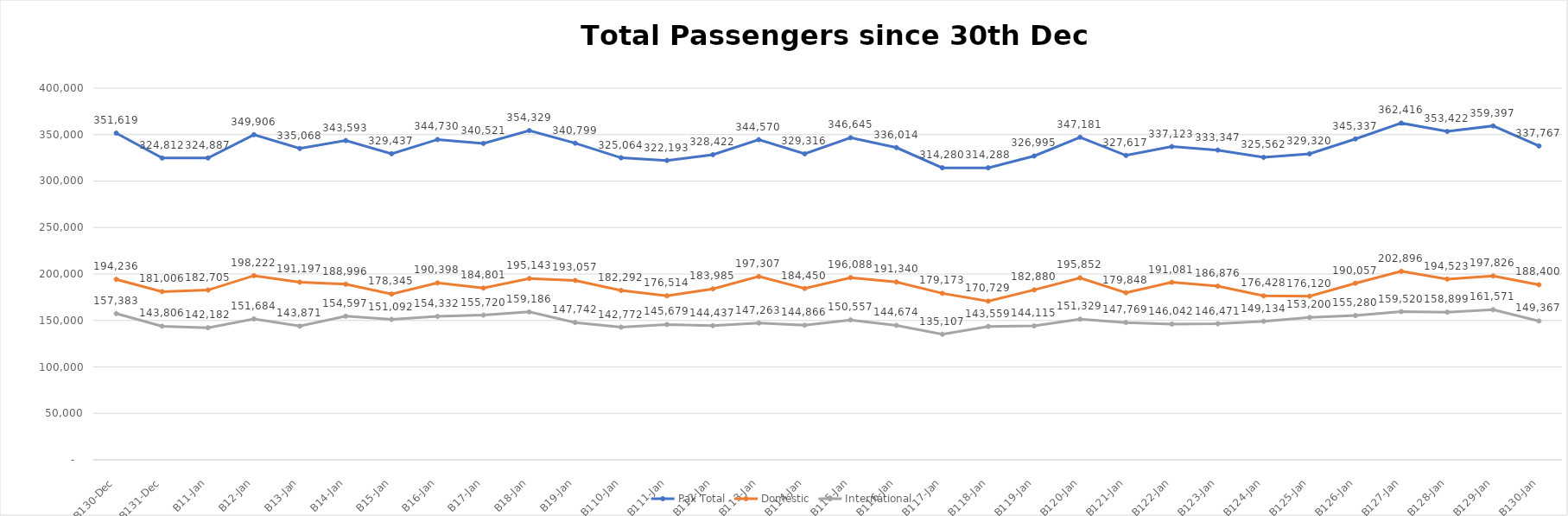
| Category | Pax Total |  Domestic  |  International  |
|---|---|---|---|
| 2022-12-30 | 351619 | 194236 | 157383 |
| 2022-12-31 | 324812 | 181006 | 143806 |
| 2023-01-01 | 324887 | 182705 | 142182 |
| 2023-01-02 | 349906 | 198222 | 151684 |
| 2023-01-03 | 335068 | 191197 | 143871 |
| 2023-01-04 | 343593 | 188996 | 154597 |
| 2023-01-05 | 329437 | 178345 | 151092 |
| 2023-01-06 | 344730 | 190398 | 154332 |
| 2023-01-07 | 340521 | 184801 | 155720 |
| 2023-01-08 | 354329 | 195143 | 159186 |
| 2023-01-09 | 340799 | 193057 | 147742 |
| 2023-01-10 | 325064 | 182292 | 142772 |
| 2023-01-11 | 322193 | 176514 | 145679 |
| 2023-01-12 | 328422 | 183985 | 144437 |
| 2023-01-13 | 344570 | 197307 | 147263 |
| 2023-01-14 | 329316 | 184450 | 144866 |
| 2023-01-15 | 346645 | 196088 | 150557 |
| 2023-01-16 | 336014 | 191340 | 144674 |
| 2023-01-17 | 314280 | 179173 | 135107 |
| 2023-01-18 | 314288 | 170729 | 143559 |
| 2023-01-19 | 326995 | 182880 | 144115 |
| 2023-01-20 | 347181 | 195852 | 151329 |
| 2023-01-21 | 327617 | 179848 | 147769 |
| 2023-01-22 | 337123 | 191081 | 146042 |
| 2023-01-23 | 333347 | 186876 | 146471 |
| 2023-01-24 | 325562 | 176428 | 149134 |
| 2023-01-25 | 329320 | 176120 | 153200 |
| 2023-01-26 | 345337 | 190057 | 155280 |
| 2023-01-27 | 362416 | 202896 | 159520 |
| 2023-01-28 | 353422 | 194523 | 158899 |
| 2023-01-29 | 359397 | 197826 | 161571 |
| 2023-01-30 | 337767 | 188400 | 149367 |